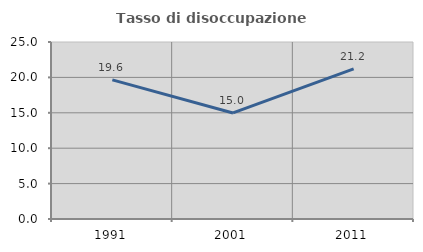
| Category | Tasso di disoccupazione giovanile  |
|---|---|
| 1991.0 | 19.647 |
| 2001.0 | 14.98 |
| 2011.0 | 21.202 |